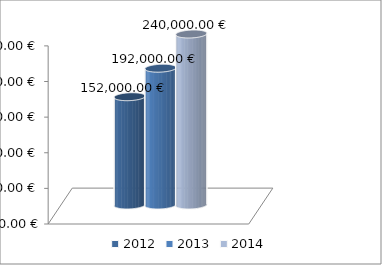
| Category | 2012 | 2013 | 2014 |
|---|---|---|---|
| 0 | 152000 | 192000 | 240000 |